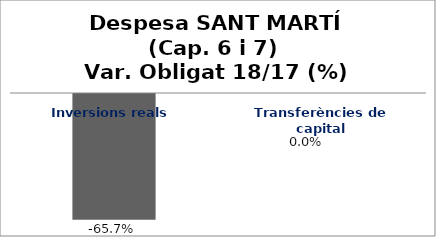
| Category | Series 0 |
|---|---|
| Inversions reals | -0.657 |
| Transferències de capital | 0 |